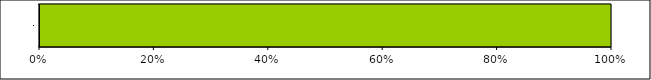
| Category | Series 0 | Series 1 | Series 2 | Series 3 |
|---|---|---|---|---|
| 0 | 0 | 0 | 14 | 0 |